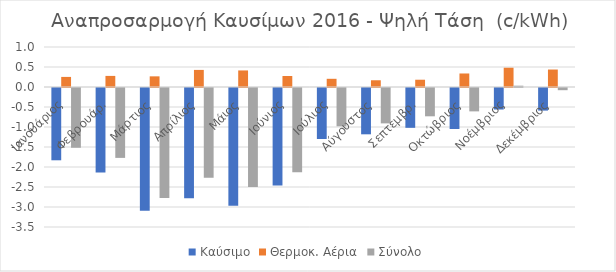
| Category | Καύσιμο | Θερμοκ. Αέρια | Σύνολο |
|---|---|---|---|
| Ιανουάριος | -1.807 | 0.252 | -1.494 |
| Φεβρουάρ. | -2.111 | 0.277 | -1.747 |
| Μάρτιος | -3.067 | 0.266 | -2.748 |
| Απρίλιος | -2.759 | 0.427 | -2.246 |
| Μάιος | -2.942 | 0.414 | -2.473 |
| Ιούνιος | -2.435 | 0.274 | -2.106 |
| Ιούλιος | -1.275 | 0.205 | -0.958 |
| Αύγουστος | -1.158 | 0.168 | -0.884 |
| Σεπτεμβρ. | -0.995 | 0.182 | -0.708 |
| Οκτώβριος | -1.025 | 0.338 | -0.584 |
| Νοέμβριος | -0.538 | 0.482 | 0.033 |
| Δεκέμβριος | -0.565 | 0.437 | -0.055 |